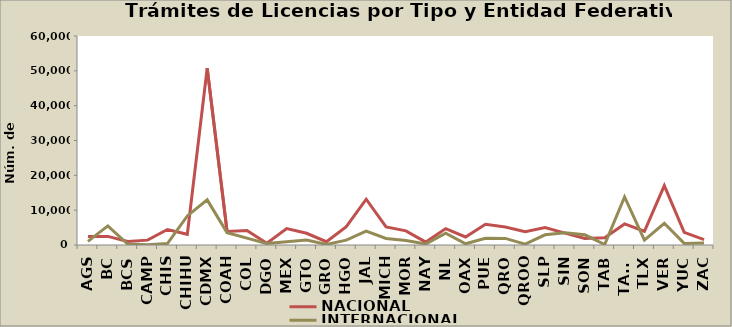
| Category | NACIONAL | INTERNACIONAL |
|---|---|---|
| AGS | 2438 | 1058 |
| BC | 2463 | 5485 |
| BCS | 998 | 272 |
| CAMP | 1397 | 103 |
| CHIS | 4451 | 416 |
| CHIHU | 3078 | 8340 |
| CDMX | 50774 | 12958 |
| COAH | 3910 | 3562 |
| COL | 4151 | 1987 |
| DGO | 499 | 409 |
| MEX | 4736 | 953 |
| GTO | 3363 | 1402 |
| GRO | 954 | 187 |
| HGO | 5285 | 1387 |
| JAL | 13144 | 3984 |
| MICH | 5180 | 1882 |
| MOR | 4063 | 1318 |
| NAY | 828 | 291 |
| NL | 4700 | 3383 |
| OAX | 2314 | 339 |
| PUE | 5949 | 1928 |
| QRO | 5169 | 1893 |
| QROO | 3818 | 247 |
| SLP | 5038 | 2921 |
| SIN | 3420 | 3500 |
| SON | 1874 | 2923 |
| TAB | 2104 | 147 |
| TAMS | 6047 | 13817 |
| TLX | 3953 | 1385 |
| VER | 17067 | 6228 |
| YUC | 3620 | 458 |
| ZAC | 1557 | 585 |